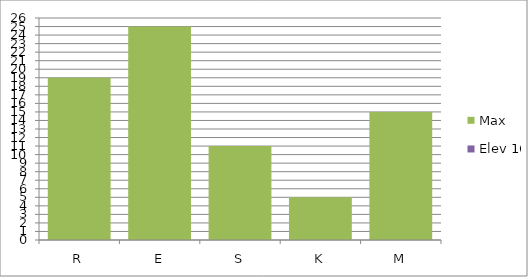
| Category | Max | Elev 16 |
|---|---|---|
| R | 19 | 0 |
| E | 25 | 0 |
| S | 11 | 0 |
| K | 5 | 0 |
| M | 15 | 0 |